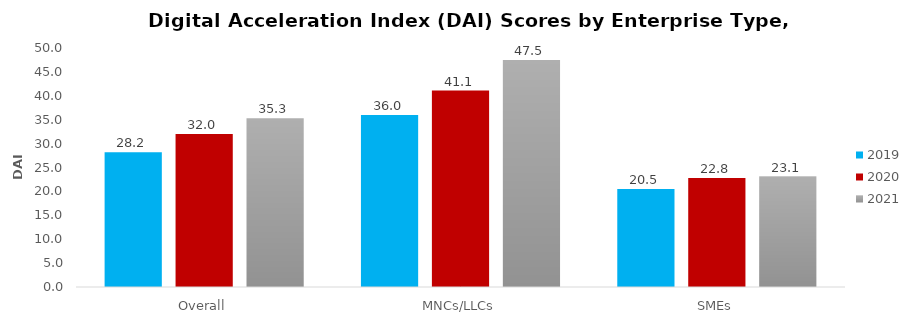
| Category | 2019 | 2020 | 2021 |
|---|---|---|---|
| Overall | 28.2 | 32 | 35.3 |
| MNCs/LLCs | 36 | 41.1 | 47.5 |
| SMEs | 20.5 | 22.8 | 23.1 |